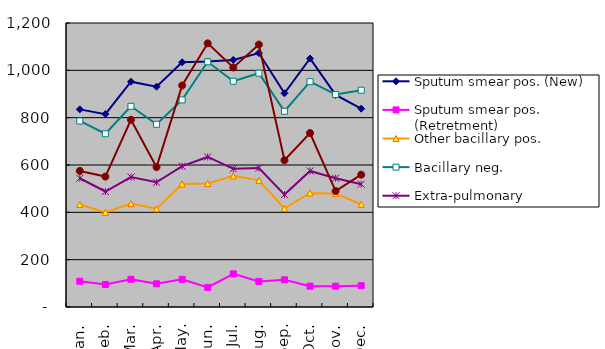
| Category | Sputum smear pos. (New) | Sputum smear pos. (Retretment) | Other bacillary pos. | Bacillary neg. | Extra-pulmonary | Chemopro-phylaxis* |
|---|---|---|---|---|---|---|
| Jan. | 835 | 109 | 433 | 786 | 544 | 575 |
| Feb. | 815 | 95 | 400 | 732 | 488 | 551 |
| Mar. | 952 | 117 | 437 | 848 | 549 | 791 |
| Apr. | 931 | 98 | 415 | 772 | 527 | 591 |
| May. | 1034 | 117 | 520 | 875 | 595 | 936 |
| Jun. | 1037 | 83 | 522 | 1036 | 634 | 1114 |
| Jul. | 1044 | 140 | 554 | 954 | 584 | 1012 |
| Aug. | 1073 | 108 | 535 | 988 | 587 | 1109 |
| Sep. | 903 | 115 | 417 | 827 | 475 | 620 |
| Oct. | 1050 | 88 | 482 | 952 | 575 | 735 |
| Nov. | 896 | 88 | 479 | 898 | 544 | 490 |
| Dec. | 838 | 90 | 434 | 916 | 519 | 559 |